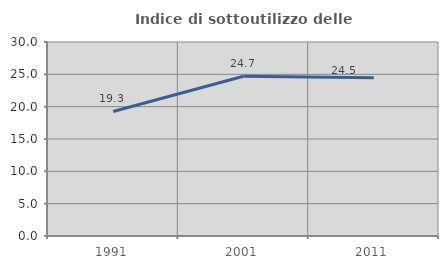
| Category | Indice di sottoutilizzo delle abitazioni  |
|---|---|
| 1991.0 | 19.261 |
| 2001.0 | 24.697 |
| 2011.0 | 24.49 |